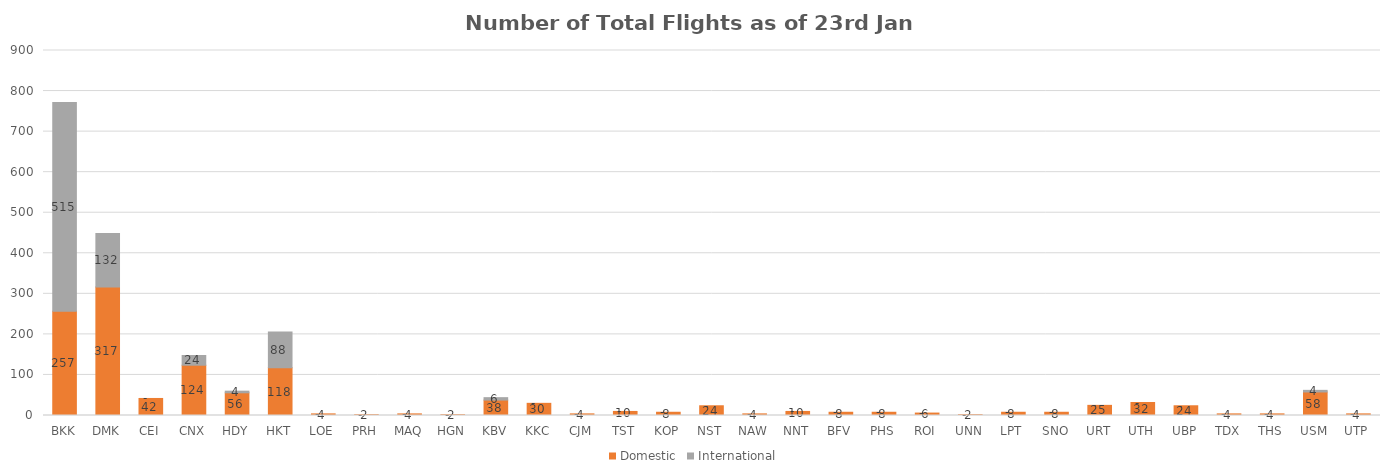
| Category | Domestic | International |
|---|---|---|
| BKK | 257 | 515 |
| DMK | 317 | 132 |
| CEI | 42 | 0 |
| CNX | 124 | 24 |
| HDY | 56 | 4 |
| HKT | 118 | 88 |
| LOE | 4 | 0 |
| PRH | 2 | 0 |
| MAQ | 4 | 0 |
| HGN | 2 | 0 |
| KBV | 38 | 6 |
| KKC | 30 | 0 |
| CJM | 4 | 0 |
| TST | 10 | 0 |
| KOP | 8 | 0 |
| NST | 24 | 0 |
| NAW | 4 | 0 |
| NNT | 10 | 0 |
| BFV | 8 | 0 |
| PHS | 8 | 0 |
| ROI | 6 | 0 |
| UNN | 2 | 0 |
| LPT | 8 | 0 |
| SNO | 8 | 0 |
| URT | 25 | 0 |
| UTH | 32 | 0 |
| UBP | 24 | 0 |
| TDX | 4 | 0 |
| THS | 4 | 0 |
| USM | 58 | 4 |
| UTP | 4 | 0 |